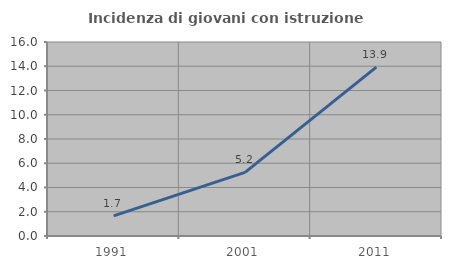
| Category | Incidenza di giovani con istruzione universitaria |
|---|---|
| 1991.0 | 1.665 |
| 2001.0 | 5.249 |
| 2011.0 | 13.923 |